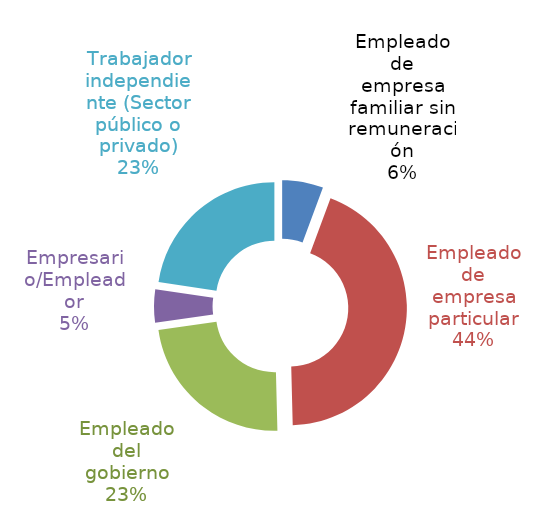
| Category | Series 0 |
|---|---|
| Empleado de empresa familiar sin remuneración | 0.051 |
| Empleado de empresa particular | 0.397 |
| Empleado del gobierno | 0.209 |
| Empresario/Empleador | 0.041 |
| Trabajador independiente (Sector público o privado) | 0.204 |